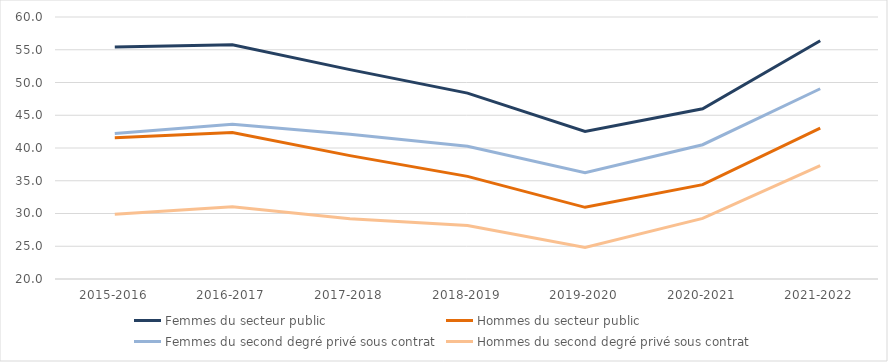
| Category | Femmes du secteur public | Hommes du secteur public | Femmes du second degré privé sous contrat | Hommes du second degré privé sous contrat |
|---|---|---|---|---|
| 2015-2016 | 55.438 | 41.58 | 42.221 | 29.9 |
| 2016-2017 | 55.745 | 42.365 | 43.636 | 31.019 |
| 2017-2018 | 51.967 | 38.836 | 42.106 | 29.199 |
| 2018-2019 | 48.379 | 35.67 | 40.27 | 28.153 |
| 2019-2020 | 42.516 | 30.942 | 36.225 | 24.829 |
| 2020-2021 | 45.984 | 34.405 | 40.503 | 29.259 |
| 2021-2022 | 56.37 | 43.02 | 49.048 | 37.313 |